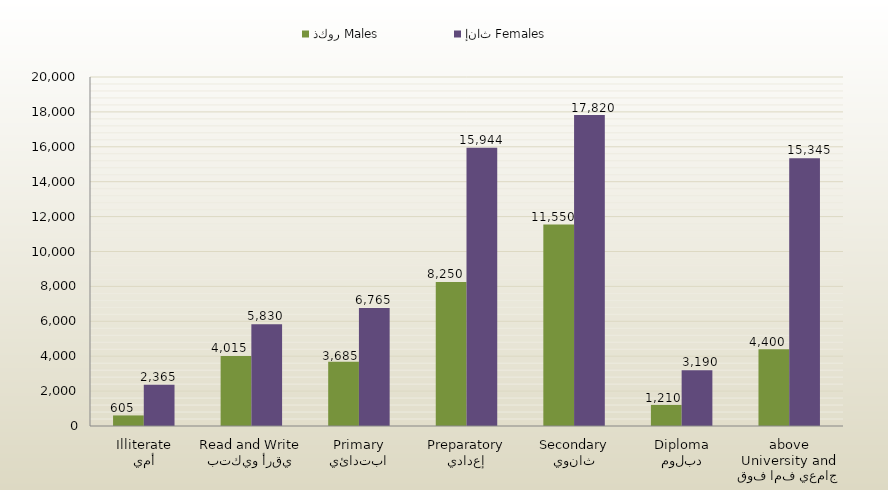
| Category | ذكور Males | إناث Females |
|---|---|---|
| أمي
Illiterate | 605 | 2365 |
| يقرأ ويكتب
Read and Write | 4015 | 5830 |
| ابتدائي
Primary | 3685 | 6765 |
| إعدادي
Preparatory | 8250 | 15944 |
| ثانوي
Secondary | 11550 | 17820 |
| دبلوم
Diploma | 1210 | 3190 |
| جامعي فما فوق
University and above | 4400 | 15345 |